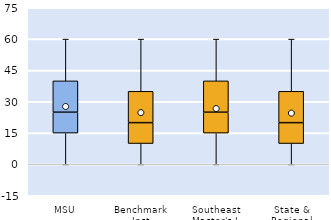
| Category | 25th | 50th | 75th |
|---|---|---|---|
| MSU | 15 | 10 | 15 |
| Benchmark Inst | 10 | 10 | 15 |
| Southeast Master's-L | 15 | 10 | 15 |
| State & Regional | 10 | 10 | 15 |